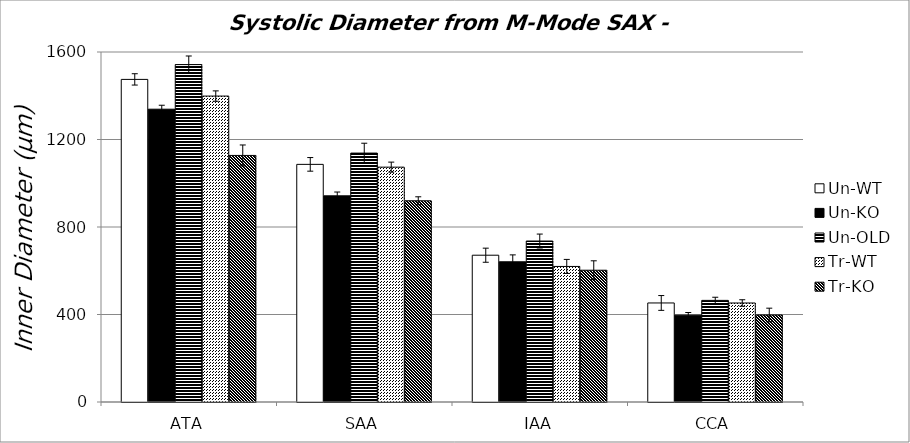
| Category | Un-WT | Un-KO | Un-OLD | Tr-WT | Tr-KO |
|---|---|---|---|---|---|
| 0 | 1474.768 | 1338.553 | 1542.438 | 1398.558 | 1127.172 |
| 1 | 1086.319 | 942.454 | 1137.868 | 1073.608 | 919.866 |
| 2 | 671.044 | 640.992 | 735.861 | 619.708 | 602.421 |
| 3 | 452.783 | 396.859 | 464.516 | 452.622 | 397.811 |